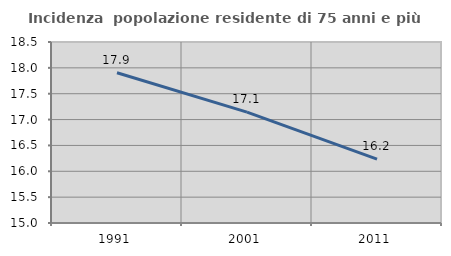
| Category | Incidenza  popolazione residente di 75 anni e più |
|---|---|
| 1991.0 | 17.905 |
| 2001.0 | 17.143 |
| 2011.0 | 16.236 |